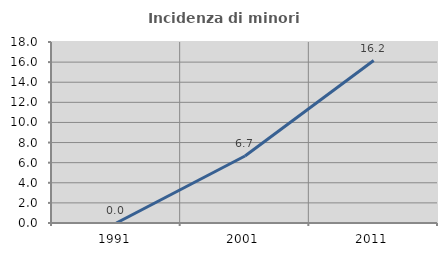
| Category | Incidenza di minori stranieri |
|---|---|
| 1991.0 | 0 |
| 2001.0 | 6.667 |
| 2011.0 | 16.157 |